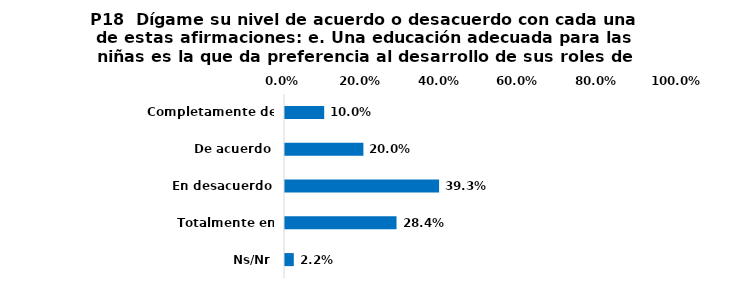
| Category | Series 0 |
|---|---|
| Completamente de acuerdo | 0.1 |
| De acuerdo | 0.2 |
| En desacuerdo | 0.393 |
| Totalmente en desacuerdo | 0.284 |
| Ns/Nr | 0.022 |